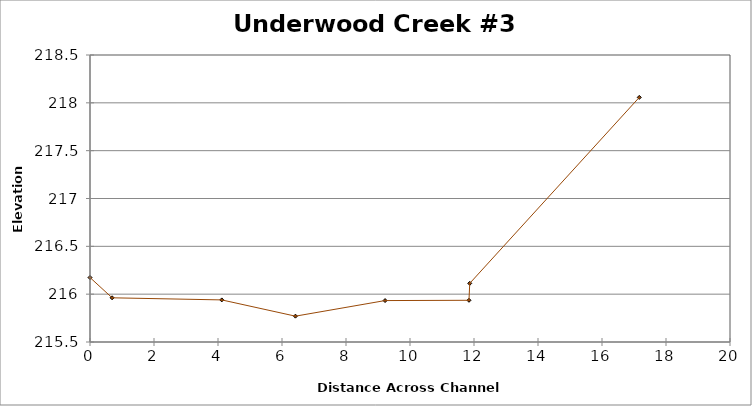
| Category | Series 0 |
|---|---|
| 0.0 | 216.174 |
| 0.6908371732920862 | 215.962 |
| 4.118632054654734 | 215.94 |
| 6.419848051128735 | 215.77 |
| 9.221150307911598 | 215.933 |
| 11.843237479676892 | 215.936 |
| 11.866818023390845 | 216.113 |
| 17.16519865895405 | 218.057 |